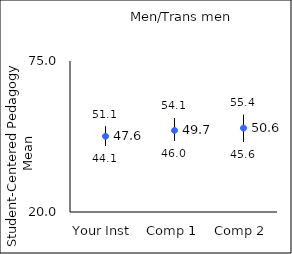
| Category | 25th percentile | 75th percentile | Mean |
|---|---|---|---|
| Your Inst | 44.1 | 51.1 | 47.59 |
| Comp 1 | 46 | 54.1 | 49.7 |
| Comp 2 | 45.6 | 55.4 | 50.57 |